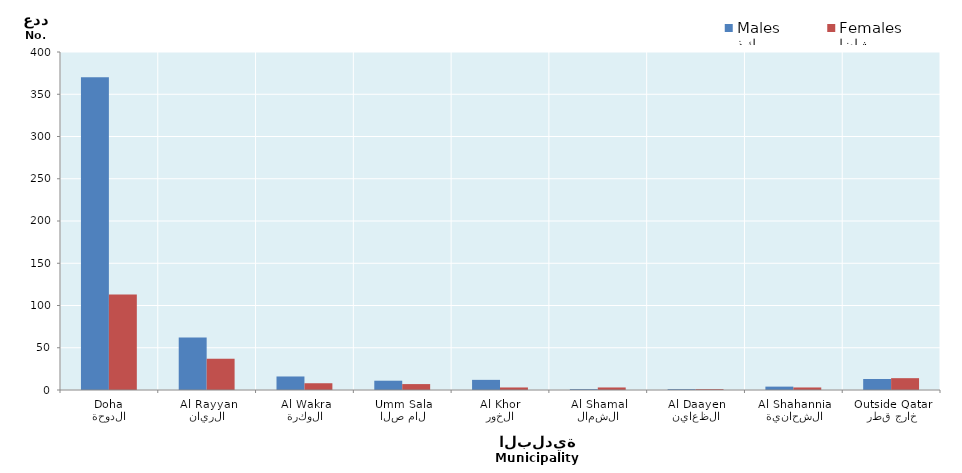
| Category | ذكور
Males | إناث
Females |
|---|---|---|
| الدوحة
Doha | 370 | 113 |
| الريان
Al Rayyan | 62 | 37 |
| الوكرة
Al Wakra | 16 | 8 |
| ام صلال
Umm Salal | 11 | 7 |
| الخور
Al Khor | 12 | 3 |
| الشمال
Al Shamal | 1 | 3 |
| الظعاين
Al Daayen | 1 | 1 |
| الشحانية
Al Shahannia | 4 | 3 |
| خارج قطر
Outside Qatar | 13 | 14 |